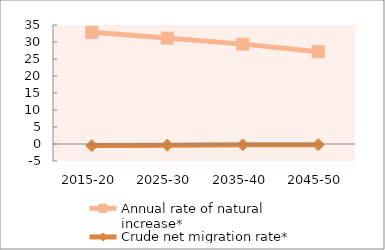
| Category | Annual rate of natural increase* | Crude net migration rate* |
|---|---|---|
| 2015-20 | 32.839 | -0.474 |
| 2025-30 | 31.146 | -0.345 |
| 2035-40 | 29.373 | -0.256 |
| 2045-50 | 27.15 | -0.193 |